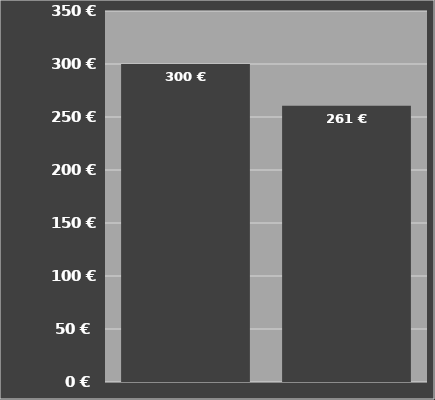
| Category | Ø-Kosten je Stunde mit Schlepper+Verpackung |
|---|---|
| Rundballen Press-Wickelkombi G1 F125 | 300.011 |
| Rundballen Press-Wickelkombi G1 F125 | 260.503 |